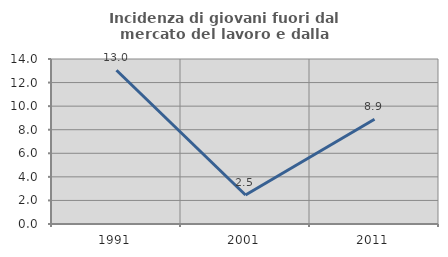
| Category | Incidenza di giovani fuori dal mercato del lavoro e dalla formazione  |
|---|---|
| 1991.0 | 13.043 |
| 2001.0 | 2.459 |
| 2011.0 | 8.889 |